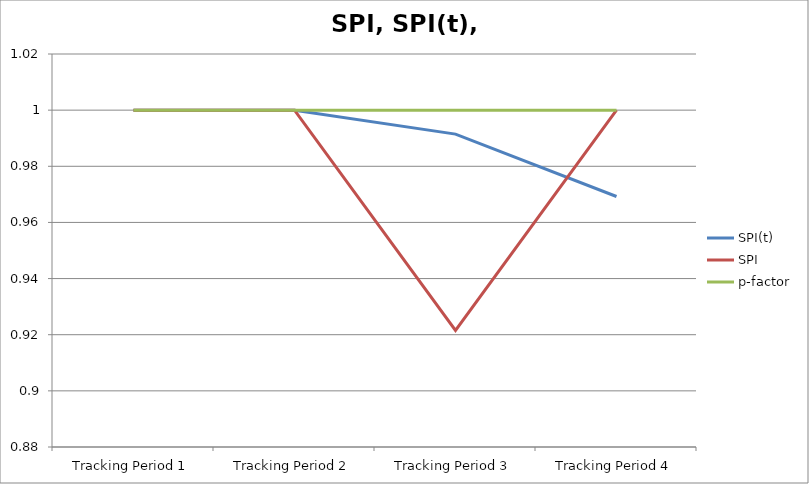
| Category | SPI(t) | SPI | p-factor |
|---|---|---|---|
| Tracking Period 1 | 1 | 1 | 1 |
| Tracking Period 2 | 1 | 1 | 1 |
| Tracking Period 3 | 0.991 | 0.922 | 1 |
| Tracking Period 4 | 0.969 | 1 | 1 |